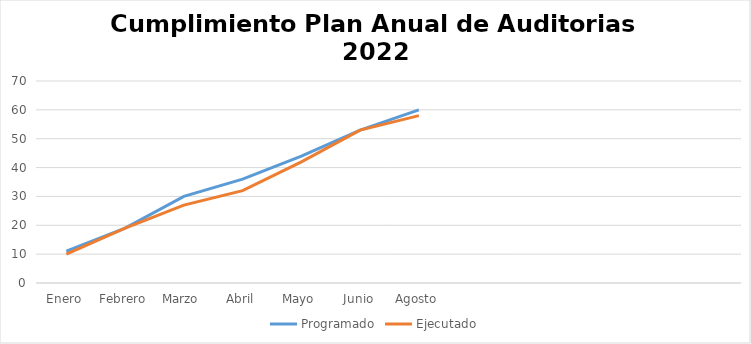
| Category | Programado | Ejecutado |
|---|---|---|
| Enero | 11 | 10 |
| Febrero | 19 | 19 |
| Marzo | 30 | 27 |
| Abril | 36 | 32 |
| Mayo | 44 | 42 |
| Junio | 53 | 53 |
| Agosto | 60 | 58 |